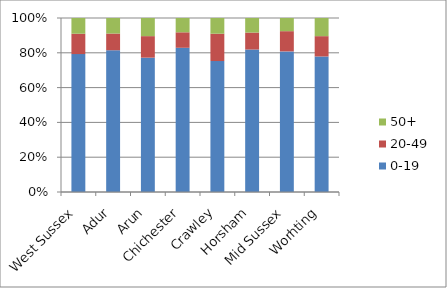
| Category | 0-19 | 20-49 | 50+ |
|---|---|---|---|
| West Sussex | 3823 | 564 | 436 |
| Adur | 365 | 43 | 40 |
| Arun | 674 | 108 | 91 |
| Chichester | 494 | 53 | 49 |
| Crawley | 633 | 132 | 76 |
| Horsham | 538 | 64 | 55 |
| Mid Sussex | 619 | 89 | 58 |
| Worhting | 500 | 75 | 67 |